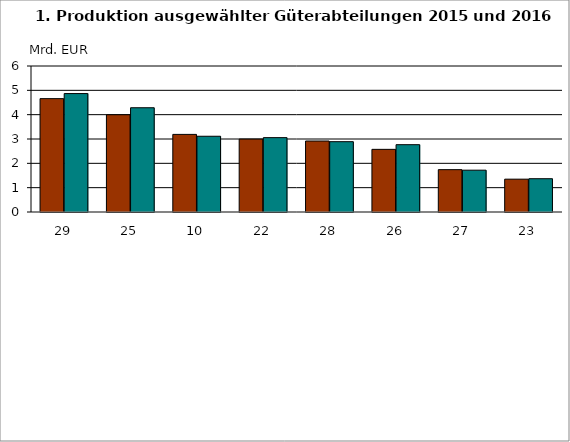
| Category | Series 0 | Series 1 |
|---|---|---|
| 29.0 | 4.659 | 4.867 |
| 25.0 | 3.998 | 4.284 |
| 10.0 | 3.189 | 3.112 |
| 22.0 | 2.997 | 3.056 |
| 28.0 | 2.917 | 2.89 |
| 26.0 | 2.574 | 2.766 |
| 27.0 | 1.74 | 1.719 |
| 23.0 | 1.35 | 1.368 |